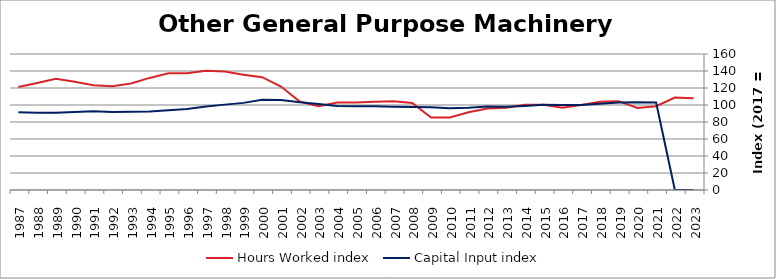
| Category | Hours Worked index | Capital Input index |
|---|---|---|
| 2023.0 | 107.974 | 0 |
| 2022.0 | 108.832 | 0 |
| 2021.0 | 98.637 | 102.88 |
| 2020.0 | 96.55 | 103.314 |
| 2019.0 | 104.493 | 102.854 |
| 2018.0 | 103.764 | 101.449 |
| 2017.0 | 100 | 100 |
| 2016.0 | 96.808 | 99.928 |
| 2015.0 | 100.218 | 100.264 |
| 2014.0 | 100.355 | 98.938 |
| 2013.0 | 96.656 | 98.069 |
| 2012.0 | 95.82 | 98.154 |
| 2011.0 | 91.38 | 96.631 |
| 2010.0 | 85.391 | 96.102 |
| 2009.0 | 85.351 | 97.259 |
| 2008.0 | 102.492 | 97.546 |
| 2007.0 | 104.391 | 98.065 |
| 2006.0 | 103.719 | 98.417 |
| 2005.0 | 102.968 | 98.614 |
| 2004.0 | 103 | 98.711 |
| 2003.0 | 98.547 | 101.163 |
| 2002.0 | 104.044 | 103.214 |
| 2001.0 | 121.673 | 105.926 |
| 2000.0 | 132.723 | 106.121 |
| 1999.0 | 135.589 | 102.502 |
| 1998.0 | 139.503 | 100.444 |
| 1997.0 | 140.303 | 98.281 |
| 1996.0 | 137.258 | 95.235 |
| 1995.0 | 137.212 | 93.82 |
| 1994.0 | 131.867 | 92.484 |
| 1993.0 | 125.299 | 92.034 |
| 1992.0 | 122.067 | 91.897 |
| 1991.0 | 123.211 | 92.695 |
| 1990.0 | 127.349 | 91.737 |
| 1989.0 | 130.754 | 90.829 |
| 1988.0 | 125.931 | 90.916 |
| 1987.0 | 121.295 | 91.471 |